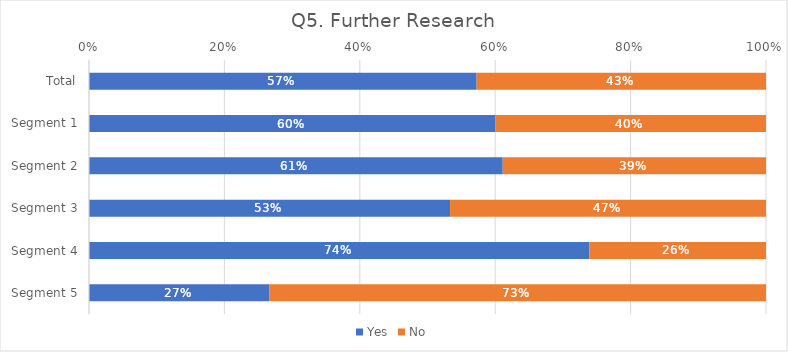
| Category | Yes | No |
|---|---|---|
| Total | 0.573 | 0.427 |
| Segment 1 | 0.6 | 0.4 |
| Segment 2 | 0.611 | 0.389 |
| Segment 3 | 0.533 | 0.467 |
| Segment 4 | 0.739 | 0.261 |
| Segment 5 | 0.267 | 0.733 |